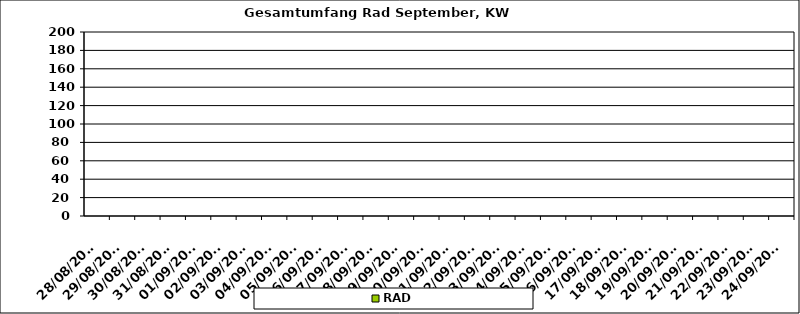
| Category | RAD |
|---|---|
| 28/08/2023 | 0 |
| 29/08/2023 | 0 |
| 30/08/2023 | 0 |
| 31/08/2023 | 0 |
| 01/09/2023 | 0 |
| 02/09/2023 | 0 |
| 03/09/2023 | 0 |
| 04/09/2023 | 0 |
| 05/09/2023 | 0 |
| 06/09/2023 | 0 |
| 07/09/2023 | 0 |
| 08/09/2023 | 0 |
| 09/09/2023 | 0 |
| 10/09/2023 | 0 |
| 11/09/2023 | 0 |
| 12/09/2023 | 0 |
| 13/09/2023 | 0 |
| 14/09/2023 | 0 |
| 15/09/2023 | 0 |
| 16/09/2023 | 0 |
| 17/09/2023 | 0 |
| 18/09/2023 | 0 |
| 19/09/2023 | 0 |
| 20/09/2023 | 0 |
| 21/09/2023 | 0 |
| 22/09/2023 | 0 |
| 23/09/2023 | 0 |
| 24/09/2023 | 0 |